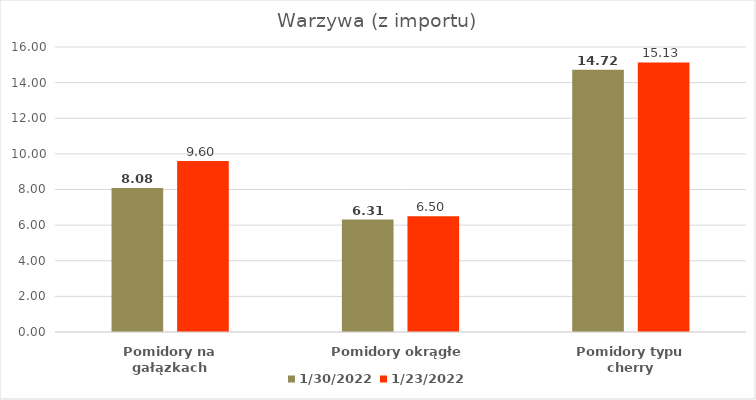
| Category | 2022-01-30 | 2022-01-23 |
|---|---|---|
| Pomidory na gałązkach | 8.08 | 9.6 |
| Pomidory okrągłe | 6.31 | 6.5 |
| Pomidory typu cherry | 14.72 | 15.13 |